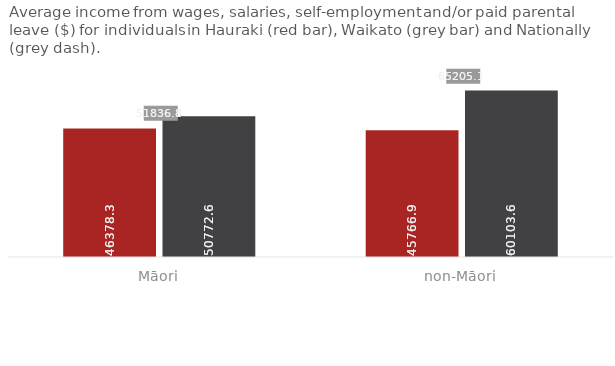
| Category | Hauraki | Waikato |
|---|---|---|
| Māori | 46378.32 | 50772.551 |
| non-Māori | 45766.926 | 60103.61 |